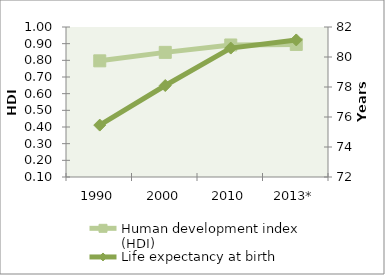
| Category | Human development index (HDI) |
|---|---|
| 1990 | 0.797 |
| 2000 | 0.848 |
| 2010 | 0.892 |
| 2013* | 0.895 |